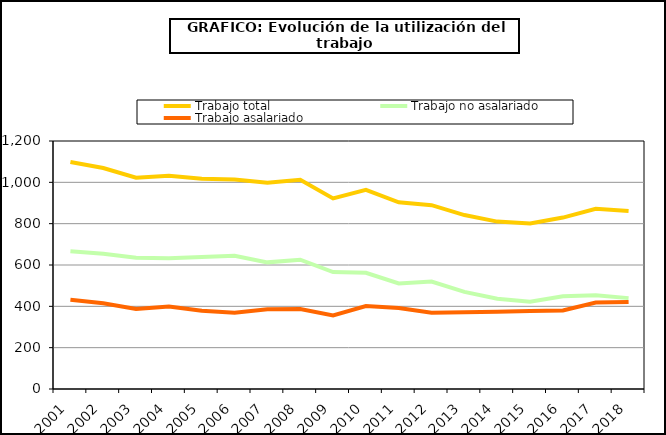
| Category | Trabajo total | Trabajo no asalariado | Trabajo asalariado |
|---|---|---|---|
| 2001.0 | 1098.738 | 666.463 | 432.275 |
| 2002.0 | 1069.314 | 654.029 | 415.285 |
| 2003.0 | 1022.665 | 635.076 | 387.589 |
| 2004.0 | 1032.156 | 632.785 | 399.371 |
| 2005.0 | 1017.234 | 638.883 | 378.351 |
| 2006.0 | 1013.286 | 644.545 | 368.741 |
| 2007.0 | 998.234 | 612.743 | 385.491 |
| 2008.0 | 1012.396 | 625.532 | 386.864 |
| 2009.0 | 922.026 | 565.965 | 356.062 |
| 2010.0 | 963.769 | 562.528 | 401.241 |
| 2011.0 | 903.306 | 510.941 | 392.364 |
| 2012.0 | 889.651 | 520.158 | 369.493 |
| 2013.0 | 841.68 | 470.11 | 371.57 |
| 2014.0 | 810.011 | 436.377 | 373.634 |
| 2015.0 | 800.53 | 422.745 | 377.785 |
| 2016.0 | 829.51 | 449.21 | 380.3 |
| 2017.0 | 871.969 | 453.769 | 418.2 |
| 2018.0 | 861.09 | 439.75 | 421.34 |